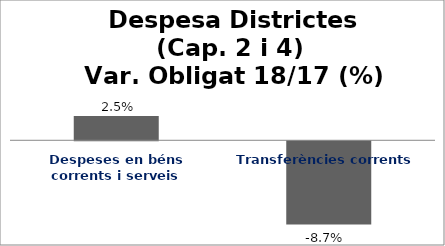
| Category | Series 0 |
|---|---|
| Despeses en béns corrents i serveis | 0.025 |
| Transferències corrents | -0.087 |